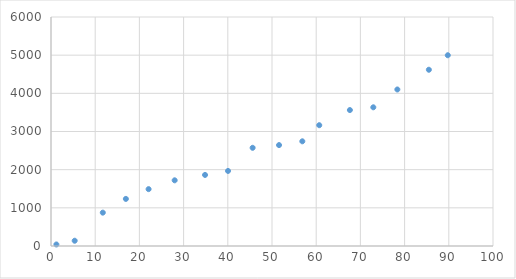
| Category | x |
|---|---|
| 1.22 | 40 |
| 5.36 | 138 |
| 11.72 | 874 |
| 16.94 | 1234 |
| 22.08 | 1490 |
| 27.98 | 1721 |
| 34.85 | 1862 |
| 40.05 | 1967 |
| 45.62 | 2573 |
| 51.59 | 2644 |
| 56.86 | 2743 |
| 60.69 | 3165 |
| 67.62 | 3562 |
| 72.92 | 3634 |
| 78.36 | 4101 |
| 85.49 | 4618 |
| 89.77 | 4998 |